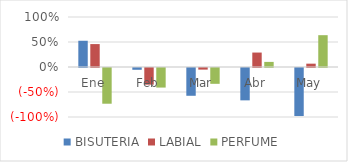
| Category | BISUTERIA | LABIAL | PERFUME |
|---|---|---|---|
| Ene | 0.525 | 0.458 | -0.714 |
| Feb | -0.036 | -0.333 | -0.391 |
| Mar | -0.556 | -0.032 | -0.316 |
| Abr | -0.647 | 0.289 | 0.102 |
| May | -0.961 | 0.067 | 0.636 |